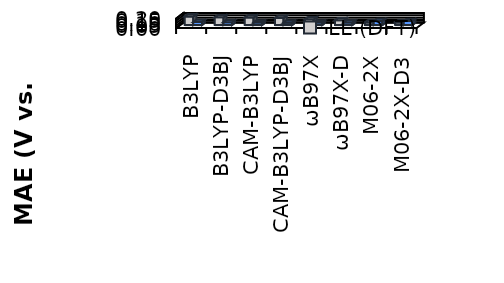
| Category |  LL (DFT) | CBH-corrected DFT |
|---|---|---|
| B3LYP | 0.185 | 0.065 |
| B3LYP-D3BJ | 0.166 | 0.063 |
| CAM-B3LYP | 0.159 | 0.053 |
| CAM-B3LYP-D3BJ | 0.149 | 0.052 |
| ωB97X | 0.123 | 0.053 |
| ωB97X-D | 0.104 | 0.054 |
| M06-2X | 0.057 | 0.085 |
| M06-2X-D3 | 0.056 | 0.085 |